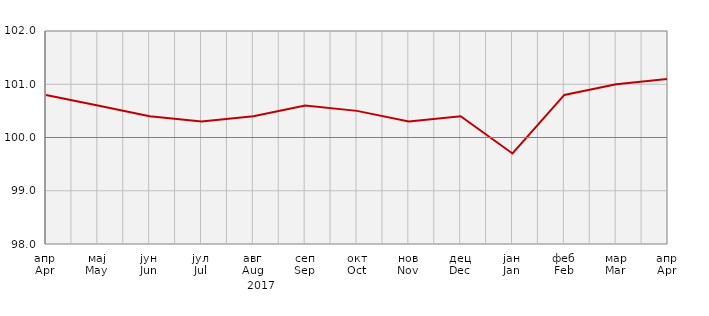
| Category | Индекси потрошачких цијена
Consumer price indices |
|---|---|
| апр
Apr | 100.8 |
| мај
May | 100.6 |
| јун
Jun | 100.4 |
| јул
Jul | 100.3 |
| авг
Aug | 100.4 |
| сеп
Sep | 100.6 |
| окт
Oct | 100.5 |
| нов
Nov | 100.3 |
| дец
Dec | 100.4 |
| јан
Jan | 99.7 |
| феб
Feb | 100.8 |
| мар
Mar | 101 |
| апр
Apr | 101.1 |